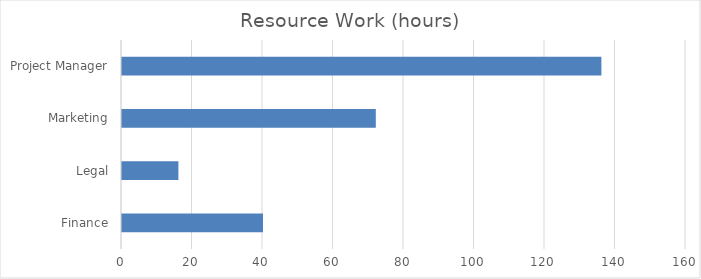
| Category | Total |
|---|---|
| Finance | 40 |
| Legal | 16 |
| Marketing | 72 |
| Project Manager | 136 |